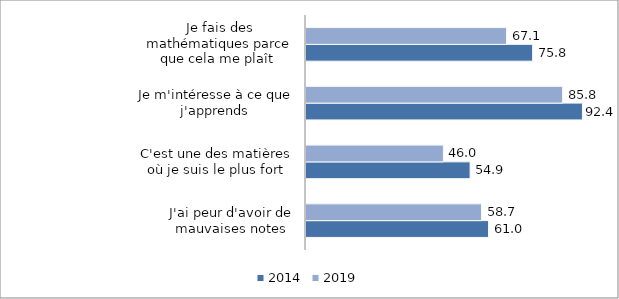
| Category | 2014 | 2019 |
|---|---|---|
| J'ai peur d'avoir de mauvaises notes | 61.042 | 58.7 |
| C'est une des matières où je suis le plus fort | 54.884 | 45.95 |
| Je m'intéresse à ce que j'apprends | 92.449 | 85.82 |
| Je fais des mathématiques parce que cela me plaît  | 75.791 | 67.07 |